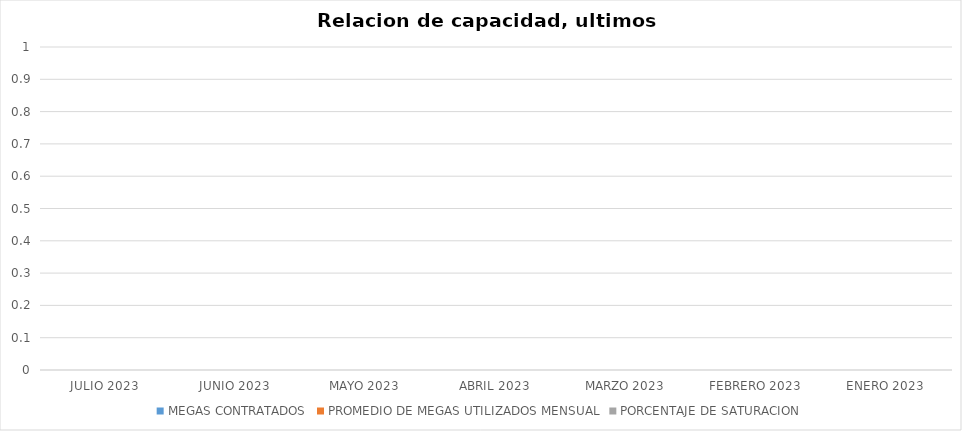
| Category | MEGAS CONTRATADOS | PROMEDIO DE MEGAS UTILIZADOS MENSUAL | PORCENTAJE DE SATURACION |
|---|---|---|---|
| JULIO 2023 |  |  | 0 |
| JUNIO 2023 |  |  | 0 |
| MAYO 2023 |  |  | 0 |
| ABRIL 2023 |  |  | 0 |
| MARZO 2023 |  |  | 0 |
| FEBRERO 2023 |  |  | 0 |
| ENERO 2023 |  |  | 0 |